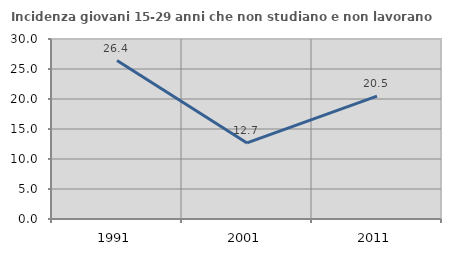
| Category | Incidenza giovani 15-29 anni che non studiano e non lavorano  |
|---|---|
| 1991.0 | 26.404 |
| 2001.0 | 12.679 |
| 2011.0 | 20.484 |